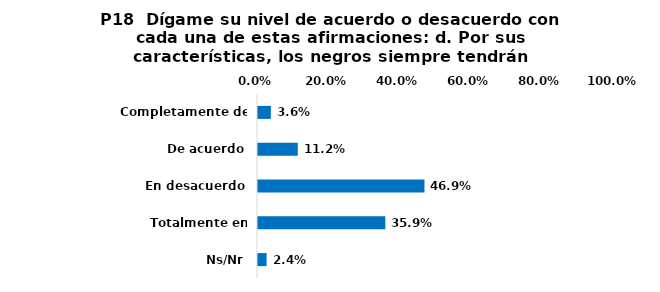
| Category | Series 0 |
|---|---|
| Completamente de acuerdo | 0.036 |
| De acuerdo | 0.112 |
| En desacuerdo | 0.469 |
| Totalmente en desacuerdo | 0.359 |
| Ns/Nr | 0.024 |